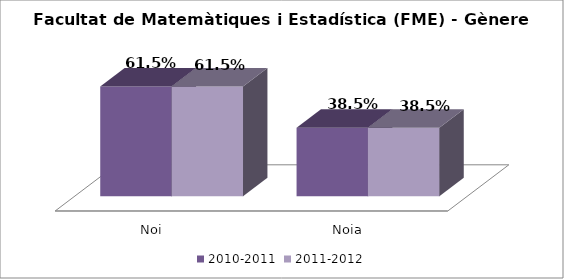
| Category | 2010-2011 | 2011-2012 |
|---|---|---|
| Noi | 0.615 | 0.615 |
| Noia | 0.385 | 0.385 |